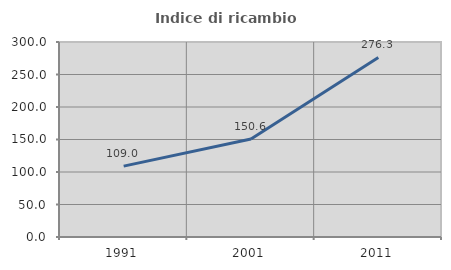
| Category | Indice di ricambio occupazionale  |
|---|---|
| 1991.0 | 108.995 |
| 2001.0 | 150.649 |
| 2011.0 | 276.296 |